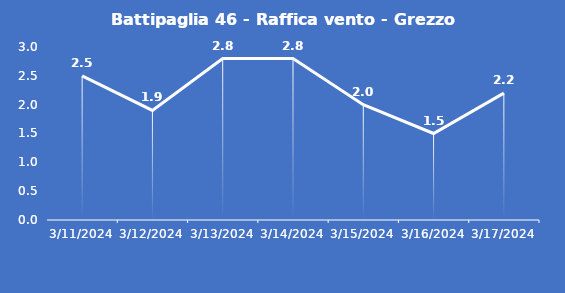
| Category | Battipaglia 46 - Raffica vento - Grezzo (m/s) |
|---|---|
| 3/11/24 | 2.5 |
| 3/12/24 | 1.9 |
| 3/13/24 | 2.8 |
| 3/14/24 | 2.8 |
| 3/15/24 | 2 |
| 3/16/24 | 1.5 |
| 3/17/24 | 2.2 |